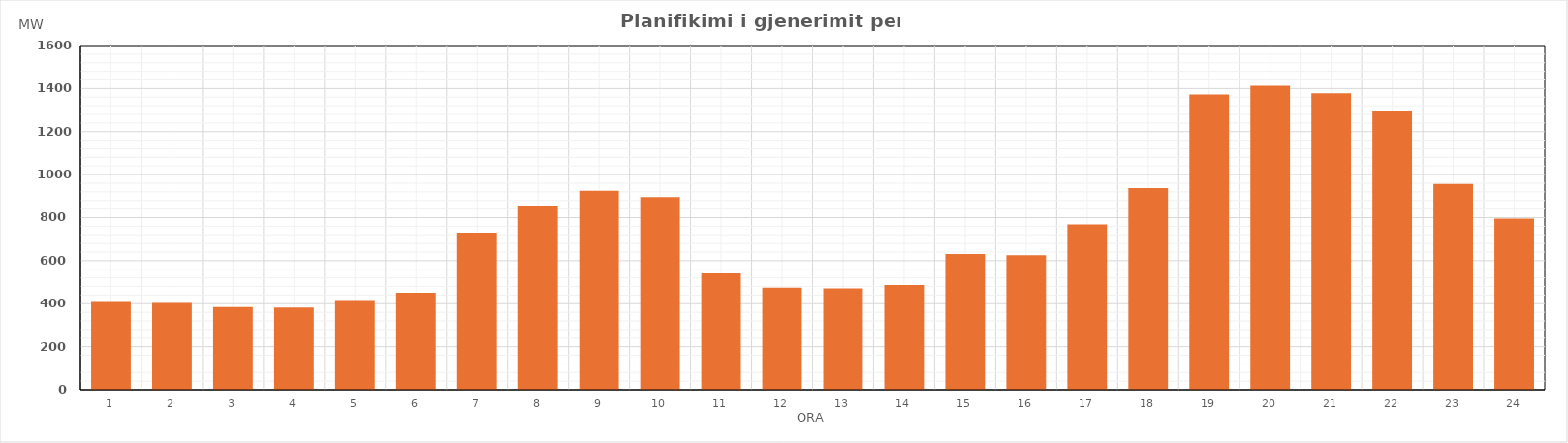
| Category | Max (MW) |
|---|---|
| 0 | 408.28 |
| 1 | 403.82 |
| 2 | 383.79 |
| 3 | 381.68 |
| 4 | 416.71 |
| 5 | 450.56 |
| 6 | 730.48 |
| 7 | 853.12 |
| 8 | 925.4 |
| 9 | 895.7 |
| 10 | 541.09 |
| 11 | 473.95 |
| 12 | 471.48 |
| 13 | 486.28 |
| 14 | 631.45 |
| 15 | 625.68 |
| 16 | 768.71 |
| 17 | 937.7 |
| 18 | 1372.95 |
| 19 | 1412.45 |
| 20 | 1377.57 |
| 21 | 1293.7 |
| 22 | 956.86 |
| 23 | 795.63 |